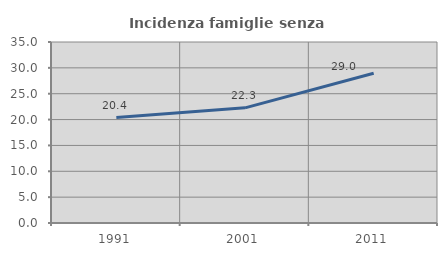
| Category | Incidenza famiglie senza nuclei |
|---|---|
| 1991.0 | 20.388 |
| 2001.0 | 22.266 |
| 2011.0 | 28.951 |